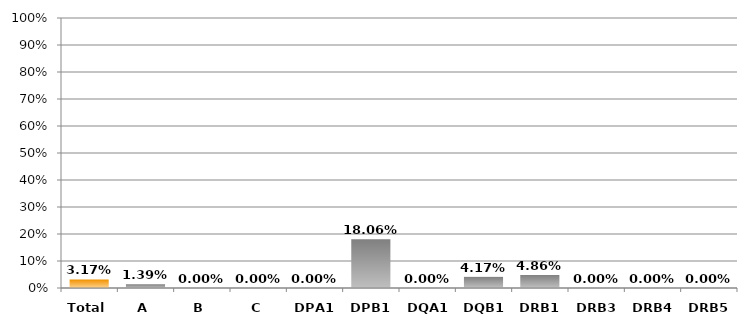
| Category | Series 0 |
|---|---|
| Total | 0.032 |
| A | 0.014 |
| B | 0 |
| C | 0 |
| DPA1 | 0 |
| DPB1 | 0.181 |
| DQA1 | 0 |
| DQB1 | 0.042 |
| DRB1 | 0.049 |
| DRB3 | 0 |
| DRB4 | 0 |
| DRB5 | 0 |